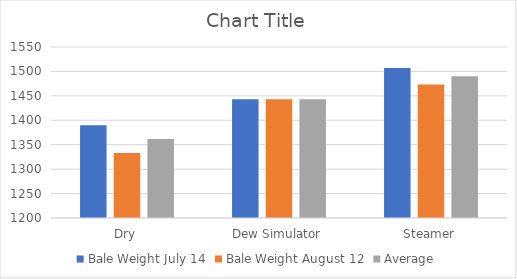
| Category | Bale Weight July 14 | Bale Weight August 12 | Average |
|---|---|---|---|
| Dry | 1390 | 1333 | 1361.5 |
| Dew Simulator | 1443 | 1443 | 1443 |
| Steamer | 1507 | 1473 | 1490 |